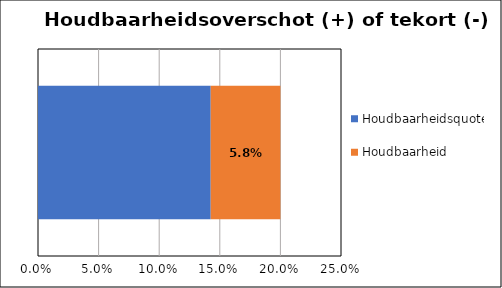
| Category | Houdbaarheidsquote | Houdbaarheid |
|---|---|---|
| Netto schuldquote ultimo 2021 | 0.143 | 0.057 |